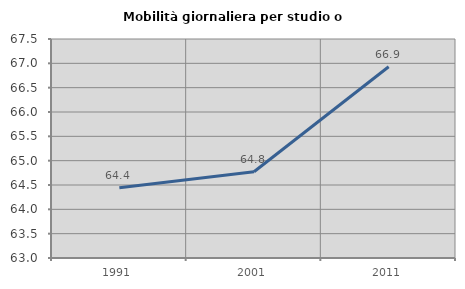
| Category | Mobilità giornaliera per studio o lavoro |
|---|---|
| 1991.0 | 64.441 |
| 2001.0 | 64.773 |
| 2011.0 | 66.93 |